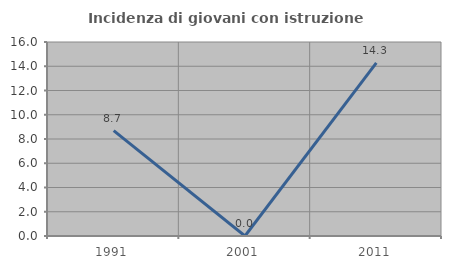
| Category | Incidenza di giovani con istruzione universitaria |
|---|---|
| 1991.0 | 8.696 |
| 2001.0 | 0 |
| 2011.0 | 14.286 |